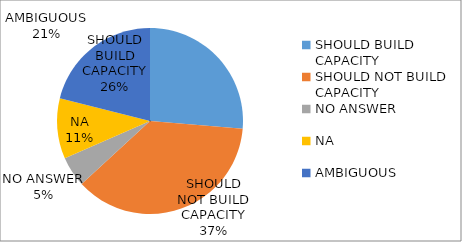
| Category | Series 0 |
|---|---|
| SHOULD BUILD CAPACITY | 0.263 |
| SHOULD NOT BUILD CAPACITY | 0.368 |
| NO ANSWER | 0.053 |
| NA | 0.105 |
| AMBIGUOUS | 0.211 |